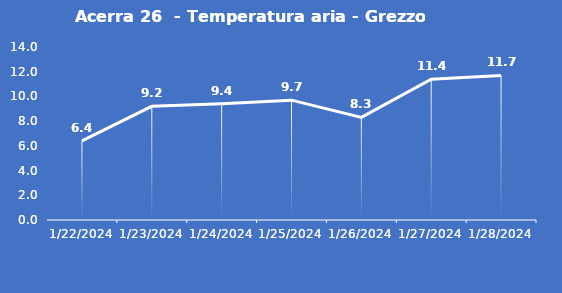
| Category | Acerra 26  - Temperatura aria - Grezzo (°C) |
|---|---|
| 1/22/24 | 6.4 |
| 1/23/24 | 9.2 |
| 1/24/24 | 9.4 |
| 1/25/24 | 9.7 |
| 1/26/24 | 8.3 |
| 1/27/24 | 11.4 |
| 1/28/24 | 11.7 |